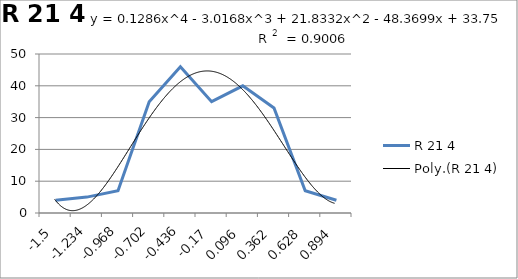
| Category | R 21 4 |
|---|---|
| -1.5 | 4 |
| -1.234 | 5 |
| -0.968 | 7 |
| -0.702 | 35 |
| -0.436 | 46 |
| -0.17 | 35 |
| 0.096 | 40 |
| 0.362 | 33 |
| 0.628 | 7 |
| 0.894 | 4 |